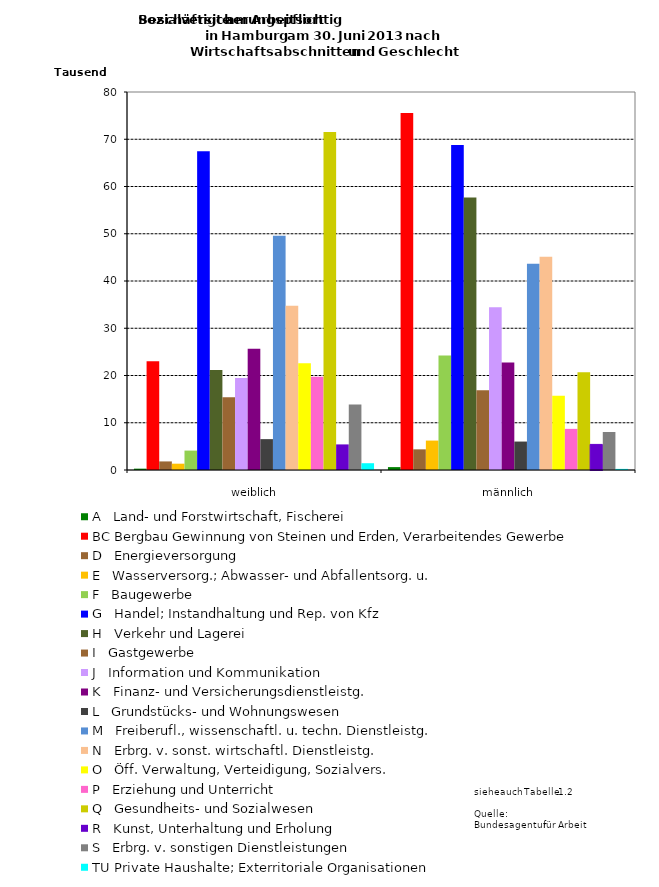
| Category | A   Land- und Forstwirtschaft, Fischerei | BC Bergbau Gewinnung von Steinen und Erden, Verarbeitendes Gewerbe | D   Energieversorgung | E   Wasserversorg.; Abwasser- und Abfallentsorg. u. | F   Baugewerbe | G   Handel; Instandhaltung und Rep. von Kfz | H   Verkehr und Lagerei | I   Gastgewerbe | J   Information und Kommunikation | K   Finanz- und Versicherungsdienstleistg. | L   Grundstücks- und Wohnungswesen | M   Freiberufl., wissenschaftl. u. techn. Dienstleistg. | N   Erbrg. v. sonst. wirtschaftl. Dienstleistg. | O   Öff. Verwaltung, Verteidigung, Sozialvers. | P   Erziehung und Unterricht | Q   Gesundheits- und Sozialwesen | R   Kunst, Unterhaltung und Erholung | S   Erbrg. v. sonstigen Dienstleistungen | TU Private Haushalte; Exterritoriale Organisationen |
|---|---|---|---|---|---|---|---|---|---|---|---|---|---|---|---|---|---|---|---|
| weiblich | 283 | 23002 | 1815 | 1337 | 4108 | 67465 | 21170 | 15406 | 19448 | 25651 | 6534 | 49591 | 34746 | 22605 | 19740 | 71509 | 5416 | 13848 | 1437 |
| männlich | 612 | 75560 | 4373 | 6227 | 24230 | 68783 | 57697 | 16875 | 34461 | 22742 | 6020 | 43659 | 45126 | 15738 | 8705 | 20695 | 5416 | 8042 | 237 |